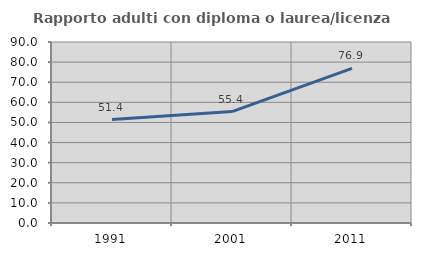
| Category | Rapporto adulti con diploma o laurea/licenza media  |
|---|---|
| 1991.0 | 51.424 |
| 2001.0 | 55.4 |
| 2011.0 | 76.89 |